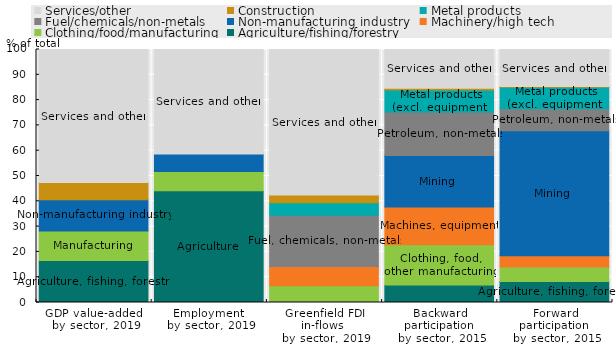
| Category | Agriculture/fishing/forestry | Clothing/food/manufacturing | Machinery/high tech | Non-manufacturing industry | Fuel/chemicals/non-metals | Metal products | Construction | Services/other |
|---|---|---|---|---|---|---|---|---|
| GDP value-added 
by sector, 2019 | 16.555 | 11.695 | 0 | 12.319 | 0 | 0 | 6.824 | 52.606 |
| Employment 
by sector, 2019 | 44.142 | 7.609 | 0 | 6.98 | 0 | 0 | 0 | 41.269 |
| Greenfield FDI in-flows 
by sector, 2019 | 0 | 6.593 | 7.674 | 0 | 20.243 | 4.963 | 3.006 | 57.52 |
| Backward participation 
by sector, 2015 | 6.916 | 15.875 | 14.959 | 20.333 | 17.201 | 8.698 | 0.716 | 15.3 |
| Forward participation 
by sector, 2015 | 8.32 | 5.666 | 4.458 | 49.417 | 8.698 | 8.489 | 0.281 | 14.671 |